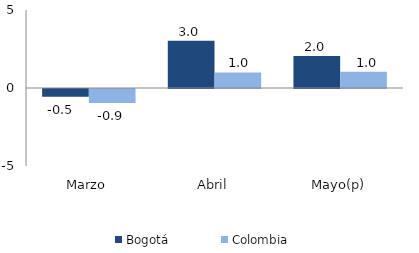
| Category | Bogotá | Colombia |
|---|---|---|
| Marzo | -0.502 | -0.897 |
| Abril | 3.028 | 0.996 |
| Mayo(p) | 2.05 | 1.038 |